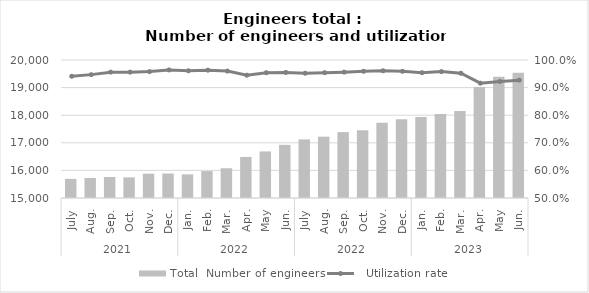
| Category | Total |
|---|---|
| 0 | 15692 |
| 1 | 15726 |
| 2 | 15761 |
| 3 | 15748 |
| 4 | 15881 |
| 5 | 15887 |
| 6 | 15856 |
| 7 | 15975 |
| 8 | 16078 |
| 9 | 16488 |
| 10 | 16687 |
| 11 | 16926 |
| 12 | 17123 |
| 13 | 17222 |
| 14 | 17387 |
| 15 | 17455 |
| 16 | 17727 |
| 17 | 17856 |
| 18 | 17936 |
| 19 | 18043 |
| 20 | 18153 |
| 21 | 19023 |
| 22 | 19393 |
| 23 | 19542 |